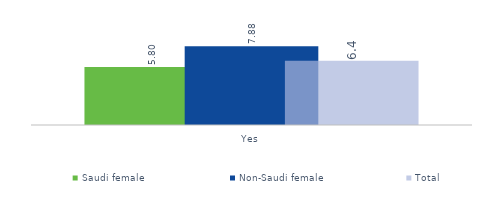
| Category | Saudi female  | Non-Saudi female | Total |
|---|---|---|---|
| Yes | 5.797 | 7.879 | 6.436 |